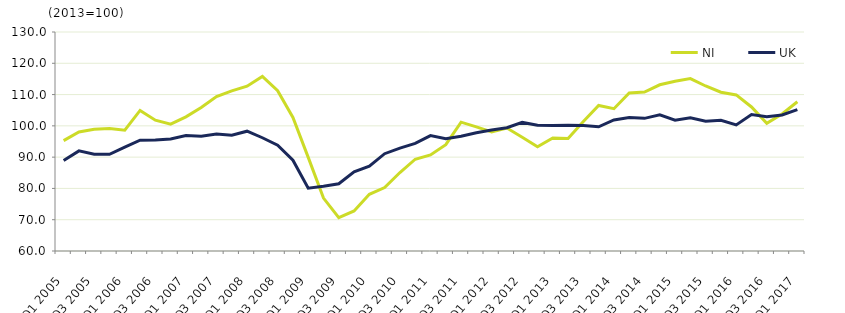
| Category | NI  | UK  |
|---|---|---|
| Q1 2005 | 95.272 | 88.9 |
| Q2 2005 | 98.042 | 92 |
| Q3 2005 | 98.936 | 90.9 |
| Q4 2005 | 99.152 | 90.9 |
| Q1 2006 | 98.622 | 93.2 |
| Q2 2006 | 104.944 | 95.4 |
| Q3 2006 | 101.808 | 95.5 |
| Q4 2006 | 100.542 | 95.8 |
| Q1 2007 | 102.892 | 96.9 |
| Q2 2007 | 105.861 | 96.7 |
| Q3 2007 | 109.341 | 97.4 |
| Q4 2007 | 111.186 | 97 |
| Q1 2008 | 112.675 | 98.3 |
| Q2 2008 | 115.793 | 96.2 |
| Q3 2008 | 111.212 | 93.8 |
| Q4 2008 | 102.677 | 89 |
| Q1 2009 | 89.937 | 80.1 |
| Q2 2009 | 76.909 | 80.7 |
| Q3 2009 | 70.69 | 81.5 |
| Q4 2009 | 72.792 | 85.3 |
| Q1 2010 | 78.129 | 87.1 |
| Q2 2010 | 80.276 | 91.1 |
| Q3 2010 | 85.08 | 92.9 |
| Q4 2010 | 89.33 | 94.4 |
| Q1 2011 | 90.695 | 96.9 |
| Q2 2011 | 93.982 | 95.9 |
| Q3 2011 | 101.177 | 96.7 |
| Q4 2011 | 99.668 | 97.8 |
| Q1 2012 | 98.052 | 98.7 |
| Q2 2012 | 99.307 | 99.4 |
| Q3 2012 | 96.364 | 101.1 |
| Q4 2012 | 93.292 | 100.2 |
| Q1 2013 | 96.146 | 100.1 |
| Q2 2013 | 95.935 | 100.2 |
| Q3 2013 | 101.391 | 100.1 |
| Q4 2013 | 106.528 | 99.7 |
| Q1 2014 | 105.477 | 101.9 |
| Q2 2014 | 110.54 | 102.7 |
| Q3 2014 | 110.826 | 102.4 |
| Q4 2014 | 113.126 | 103.5 |
| Q1 2015 | 114.281 | 101.8 |
| Q2 2015 | 115.112 | 102.6 |
| Q3 2015 | 112.741 | 101.5 |
| Q4 2015 | 110.752 | 101.8 |
| Q1 2016 | 109.881 | 100.3 |
| Q2 2016 | 106.038 | 103.6 |
| Q3 2016 | 100.823 | 102.9 |
| Q4 2016 | 103.785 | 103.5 |
| Q1 2017 | 107.714 | 105.2 |